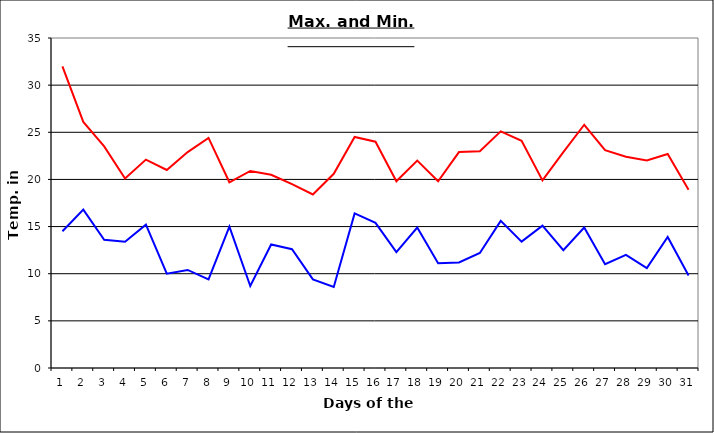
| Category | Series 0 | Series 1 |
|---|---|---|
| 0 | 32 | 14.5 |
| 1 | 26.1 | 16.8 |
| 2 | 23.5 | 13.6 |
| 3 | 20.1 | 13.4 |
| 4 | 22.1 | 15.2 |
| 5 | 21 | 10 |
| 6 | 22.9 | 10.4 |
| 7 | 24.4 | 9.4 |
| 8 | 19.7 | 15 |
| 9 | 20.9 | 8.7 |
| 10 | 20.5 | 13.1 |
| 11 | 19.5 | 12.6 |
| 12 | 18.4 | 9.4 |
| 13 | 20.6 | 8.6 |
| 14 | 24.5 | 16.4 |
| 15 | 24 | 15.4 |
| 16 | 19.8 | 12.3 |
| 17 | 22 | 14.9 |
| 18 | 19.8 | 11.1 |
| 19 | 22.9 | 11.2 |
| 20 | 23 | 12.2 |
| 21 | 25.1 | 15.6 |
| 22 | 24.1 | 13.4 |
| 23 | 19.9 | 15.1 |
| 24 | 22.9 | 12.5 |
| 25 | 25.8 | 14.9 |
| 26 | 23.1 | 11 |
| 27 | 22.4 | 12 |
| 28 | 22 | 10.6 |
| 29 | 22.7 | 13.9 |
| 30 | 18.9 | 9.8 |